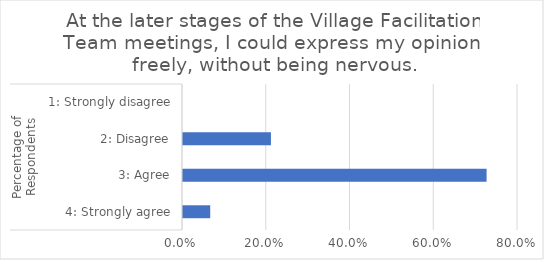
| Category | At the later stages of the Village Facilitation Team meetings, I could express my opinions freely, without being nervous. |
|---|---|
| 0 | 0.065 |
| 1 | 0.725 |
| 2 | 0.21 |
| 3 | 0 |